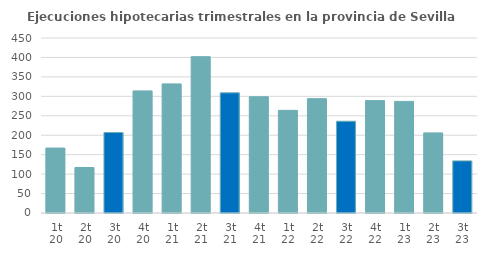
| Category | Series 0 |
|---|---|
| 1t 20 | 167 |
| 2t 20 | 117 |
| 3t 20 | 207 |
| 4t 20 | 314 |
| 1t 21 | 332 |
| 2t 21 | 402 |
| 3t 21 | 309 |
| 4t 21 | 299 |
| 1t 22 | 264 |
| 2t 22 | 294 |
| 3t 22 | 236 |
| 4t 22 | 289 |
| 1t 23 | 287 |
| 2t 23 | 206 |
| 3t 23 | 134 |